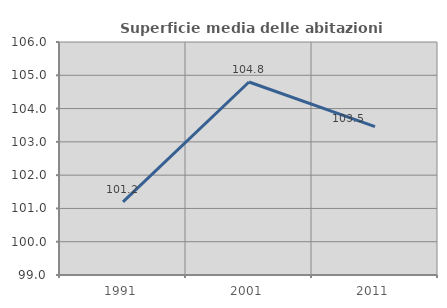
| Category | Superficie media delle abitazioni occupate |
|---|---|
| 1991.0 | 101.199 |
| 2001.0 | 104.797 |
| 2011.0 | 103.46 |